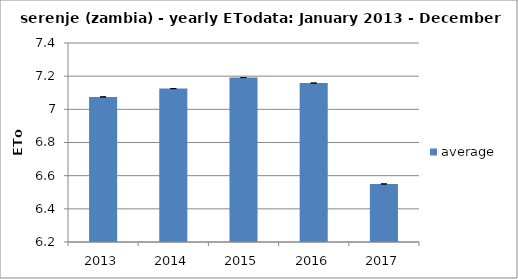
| Category | average  |
|---|---|
| 2013.0 | 7.075 |
| 2014.0 | 7.125 |
| 2015.0 | 7.192 |
| 2016.0 | 7.158 |
| 2017.0 | 6.55 |